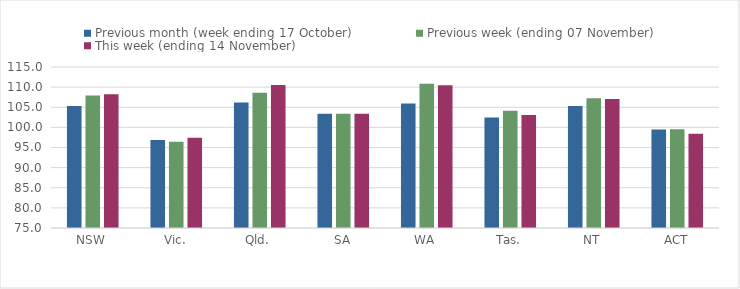
| Category | Previous month (week ending 17 October) | Previous week (ending 07 November) | This week (ending 14 November) |
|---|---|---|---|
| NSW | 105.34 | 107.93 | 108.24 |
| Vic. | 96.85 | 96.43 | 97.44 |
| Qld. | 106.21 | 108.62 | 110.55 |
| SA | 103.38 | 103.38 | 103.38 |
| WA | 105.95 | 110.84 | 110.47 |
| Tas. | 102.46 | 104.12 | 103.05 |
| NT | 105.32 | 107.21 | 107.06 |
| ACT | 99.45 | 99.53 | 98.41 |